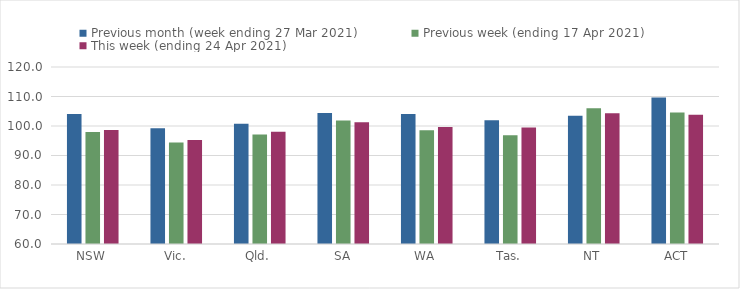
| Category | Previous month (week ending 27 Mar 2021) | Previous week (ending 17 Apr 2021) | This week (ending 24 Apr 2021) |
|---|---|---|---|
| NSW | 104.05 | 97.97 | 98.62 |
| Vic. | 99.24 | 94.39 | 95.27 |
| Qld. | 100.77 | 97.15 | 98.09 |
| SA | 104.43 | 101.84 | 101.23 |
| WA | 104.07 | 98.52 | 99.68 |
| Tas. | 101.91 | 96.89 | 99.51 |
| NT | 103.51 | 106 | 104.36 |
| ACT | 109.69 | 104.54 | 103.79 |